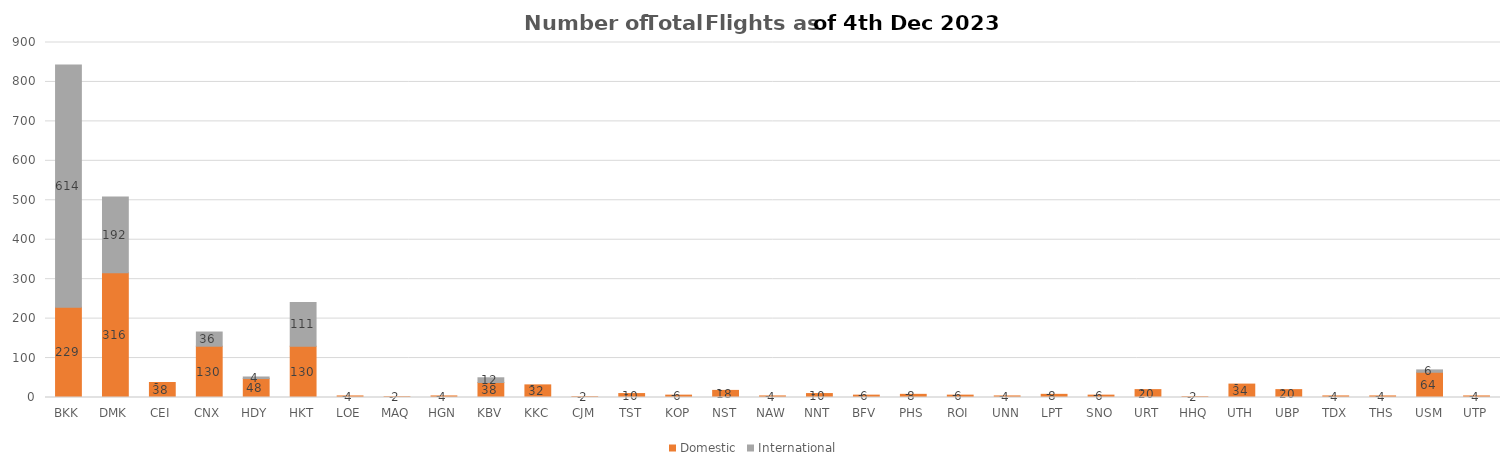
| Category | Domestic | International |
|---|---|---|
| BKK | 229 | 614 |
| DMK | 316 | 192 |
| CEI | 38 | 0 |
| CNX | 130 | 36 |
| HDY | 48 | 4 |
| HKT | 130 | 111 |
| LOE | 4 | 0 |
| MAQ | 2 | 0 |
| HGN | 4 | 0 |
| KBV | 38 | 12 |
| KKC | 32 | 0 |
| CJM | 2 | 0 |
| TST | 10 | 0 |
| KOP | 6 | 0 |
| NST | 18 | 0 |
| NAW | 4 | 0 |
| NNT | 10 | 0 |
| BFV | 6 | 0 |
| PHS | 8 | 0 |
| ROI | 6 | 0 |
| UNN | 4 | 0 |
| LPT | 8 | 0 |
| SNO | 6 | 0 |
| URT | 20 | 0 |
| HHQ | 2 | 0 |
| UTH | 34 | 0 |
| UBP | 20 | 0 |
| TDX | 4 | 0 |
| THS | 4 | 0 |
| USM | 64 | 6 |
| UTP | 4 | 0 |